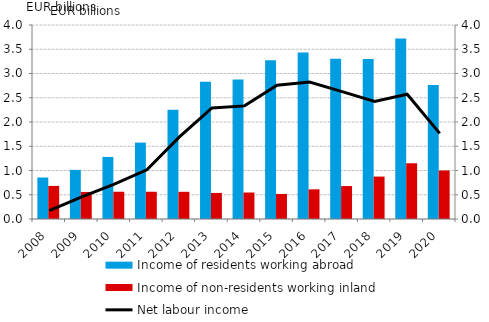
| Category | Income of residents working abroad | Income of non-residents working inland |
|---|---|---|
| 2008.0 | 0.855 | 0.682 |
| 2009.0 | 1.013 | 0.558 |
| 2010.0 | 1.28 | 0.562 |
| 2011.0 | 1.576 | 0.562 |
| 2012.0 | 2.254 | 0.561 |
| 2013.0 | 2.828 | 0.538 |
| 2014.0 | 2.878 | 0.546 |
| 2015.0 | 3.275 | 0.517 |
| 2016.0 | 3.435 | 0.612 |
| 2017.0 | 3.306 | 0.679 |
| 2018.0 | 3.297 | 0.875 |
| 2019.0 | 3.721 | 1.149 |
| 2020.0 | 2.765 | 1 |